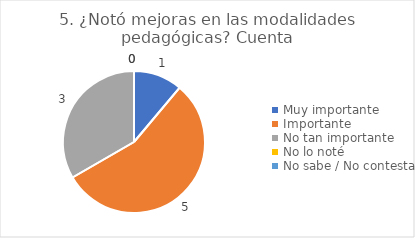
| Category | 5. ¿Notó mejoras en las modalidades pedagógicas? |
|---|---|
| Muy importante  | 0.111 |
| Importante  | 0.556 |
| No tan importante  | 0.333 |
| No lo noté  | 0 |
| No sabe / No contesta | 0 |